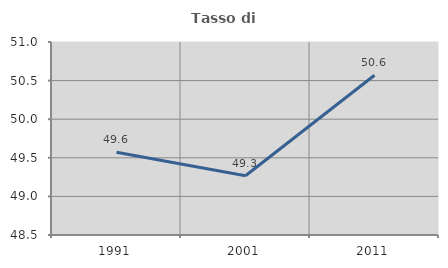
| Category | Tasso di occupazione   |
|---|---|
| 1991.0 | 49.571 |
| 2001.0 | 49.267 |
| 2011.0 | 50.569 |